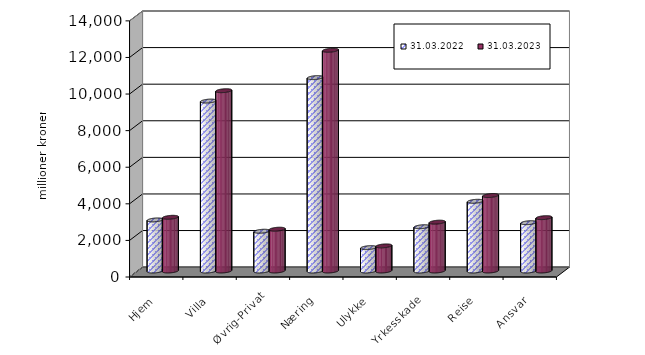
| Category | 31.03.2022 | 31.03.2023 |
|---|---|---|
| Hjem | 2791.509 | 2935.368 |
| Villa | 9287.887 | 9855.279 |
| Øvrig-Privat | 2173.376 | 2284.698 |
| Næring | 10571.09 | 12063.918 |
| Ulykke | 1277.828 | 1372.872 |
| Yrkesskade | 2420.38 | 2669.629 |
| Reise | 3810.492 | 4124.216 |
| Ansvar | 2641.305 | 2916.611 |